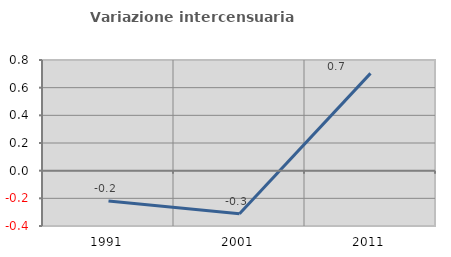
| Category | Variazione intercensuaria annua |
|---|---|
| 1991.0 | -0.219 |
| 2001.0 | -0.311 |
| 2011.0 | 0.703 |